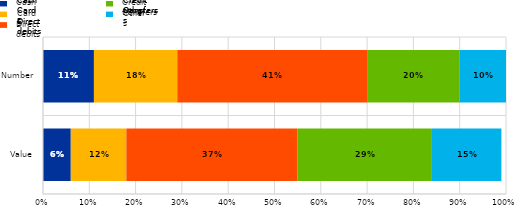
| Category | Cash | Cards | Direct debits | Credit transfers | Others |
|---|---|---|---|---|---|
| Value | 0.06 | 0.12 | 0.37 | 0.29 | 0.15 |
| Number | 0.11 | 0.18 | 0.41 | 0.2 | 0.1 |